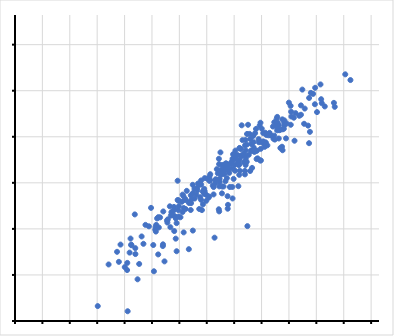
| Category | RTOC_mCherryhi...Normalized.means |
|---|---|
| 623.7666666667 | 49.133 |
| 876.1 | 132 |
| 325.2666666667 | 34.733 |
| 238.9 | 32.667 |
| 134.5 | 17.867 |
| 360.0666666667 | 60.833 |
| 285.5 | 57.6 |
| 694.4 | 115.5 |
| 88.9 | 14.033 |
| 983.6333333333 | 159.933 |
| 6814.9333333333 | 844.1 |
| 92.6333333333 | 22.267 |
| 13055.3333333333 | 2520.9 |
| 867.4666666667 | 171.267 |
| 4717.8 | 908.8 |
| 3036.4666666667 | 1241.567 |
| 989.1333333333 | 392.233 |
| 1431.8 | 69.533 |
| 701.2666666667 | 108.333 |
| 69.2 | 5.367 |
| 224.8333333333 | 59.933 |
| 175.7333333333 | 24.067 |
| 453.1 | 112.767 |
| 1344.4 | 366.3 |
| 169.1666666667 | 40.2 |
| 1138.7666666667 | 231.467 |
| 752.1666666667 | 186.467 |
| 68.2333333333 | 18.533 |
| 12783.0666666667 | 2840.733 |
| 132.3 | 39.367 |
| 6010.6666666667 | 1513.467 |
| 6649.3666666667 | 1432.867 |
| 1806.6666666667 | 523.3 |
| 10141.6 | 2551.367 |
| 1534.5333333333 | 365.5 |
| 1979.4666666667 | 501.133 |
| 251.2333333333 | 92.833 |
| 423.4666666667 | 116.5 |
| 3803.1333333333 | 975.533 |
| 83.9 | 35.867 |
| 1612.4 | 401.267 |
| 1855.0 | 535.167 |
| 918.3 | 225.767 |
| 9401.9333333333 | 2819.267 |
| 755.9666666667 | 229.433 |
| 3485.9666666667 | 682.867 |
| 481.1666666667 | 183.2 |
| 341.3666666667 | 112.967 |
| 3437.8666666667 | 758.733 |
| 19418.8666666667 | 5645.6 |
| 1792.5666666667 | 673.433 |
| 245.1666666667 | 272.667 |
| 149.8666666667 | 29.667 |
| 7899.7333333333 | 2725.633 |
| 1010.1666666667 | 288.167 |
| 485.5333333333 | 198.967 |
| 2769.6333333333 | 963.8 |
| 233.5 | 47.7 |
| 783.2333333333 | 229.333 |
| 344.2333333333 | 138.867 |
| 8334.3666666667 | 2151.8 |
| 708.8 | 262.867 |
| 1182.8666666667 | 368.3 |
| 709.5 | 288.767 |
| 3168.2 | 972.167 |
| 543.5666666667 | 169.633 |
| 1151.9666666667 | 436.533 |
| 2015.9333333333 | 502.3 |
| 608.7 | 180.533 |
| 2823.5666666667 | 1060.4 |
| 821.8 | 269.167 |
| 2864.8333333333 | 940.833 |
| 1164.6 | 325.433 |
| 1976.2 | 878.333 |
| 5325.6 | 1925.633 |
| 976.9 | 225.967 |
| 832.8333333333 | 461.067 |
| 2443.3 | 1070.233 |
| 285.5 | 120.067 |
| 103.1666666667 | 40.833 |
| 4275.5333333333 | 2596.133 |
| 168.5333333333 | 38.167 |
| 2009.6666666667 | 712.967 |
| 3213.4 | 1248.4 |
| 217.3 | 108.967 |
| 1455.3333333333 | 1468.867 |
| 29.1 | 3.4 |
| 1950.1333333333 | 1429.633 |
| 2373.5666666667 | 791.1 |
| 64.3333333333 | 20.267 |
| 1166.9666666667 | 445.333 |
| 4639.7666666667 | 1816.7 |
| 703.2666666667 | 229.9 |
| 1407.3333333333 | 481.167 |
| 1141.2 | 480.467 |
| 505.8 | 149.033 |
| 231.5333333333 | 92 |
| 536.7333333333 | 163.833 |
| 869.9333333333 | 117.433 |
| 3046.9 | 1862.4 |
| 2135.1333333333 | 891.467 |
| 68.5333333333 | 23 |
| 1047.8333333333 | 368.433 |
| 3602.4333333333 | 1303.7 |
| 641.6666666667 | 285.2 |
| 1311.6666666667 | 475.867 |
| 139.1333333333 | 62.5 |
| 4842.9666666667 | 2085.9 |
| 191.3666666667 | 85.3 |
| 3870.0666666667 | 1525.7 |
| 2510.4 | 1152.933 |
| 3298.7333333333 | 730.633 |
| 506.2 | 178.467 |
| 767.5333333333 | 363.033 |
| 3656.2666666667 | 1673.767 |
| 6105.9333333333 | 2392.967 |
| 249.0666666667 | 112.767 |
| 2561.2333333333 | 1079.933 |
| 233.9666666667 | 87.433 |
| 860.4 | 445.467 |
| 479.8333333333 | 213.333 |
| 847.0 | 377.633 |
| 3157.5 | 1453.433 |
| 277.8666666667 | 179.5 |
| 32.4666666667 | 6.267 |
| 2270.9 | 858.333 |
| 42.7333333333 | 21.933 |
| 392.8 | 179.333 |
| 118.5333333333 | 69.133 |
| 5552.2 | 1986.833 |
| 4289.9 | 1469.8 |
| 433.4 | 165.933 |
| 2557.8666666667 | 1072.233 |
| 635.9 | 253.033 |
| 3079.1666666667 | 1356.8 |
| 595.9333333333 | 235.8 |
| 2217.2 | 756.5 |
| 3634.5 | 1436.233 |
| 461.4 | 197.567 |
| 1176.2666666667 | 515.633 |
| 2273.2333333333 | 860.667 |
| 203.9666666667 | 67.3 |
| 209.0666666667 | 105.6 |
| 5554.7 | 2633.3 |
| 140.1333333333 | 67.5 |
| 263.2333333333 | 90.8 |
| 883.6666666667 | 398.2 |
| 353.4666666667 | 157.6 |
| 238.7333333333 | 76.067 |
| 1221.7666666667 | 582.967 |
| 1375.5 | 535.133 |
| 1129.8 | 459.067 |
| 152.2333333333 | 66.767 |
| 1481.6 | 593.667 |
| 330.0666666667 | 145.133 |
| 223.3333333333 | 124.067 |
| 660.6666666667 | 386.167 |
| 443.1333333333 | 153.333 |
| 403.7666666667 | 203.9 |
| 249.4 | 150.933 |
| 808.2 | 399.467 |
| 983.6333333333 | 529.367 |
| 400.6333333333 | 218.067 |
| 1823.2 | 673.5 |
| 1175.7 | 722.633 |
| 465.2666666667 | 133.967 |
| 75.7 | 39.867 |
| 1676.9 | 742.733 |
| 360.7 | 187.833 |
| 1369.8 | 680.367 |
| 1110.9333333333 | 592 |
| 639.9333333333 | 277.767 |
| 895.3666666667 | 389.133 |
| 550.5 | 270.6 |
| 141.2 | 59.067 |
| 1344.9666666667 | 330.267 |
| 3002.5 | 1426.4 |
| 6826.5333333333 | 3293.933 |
| 72.7333333333 | 31.333 |
| 864.1333333333 | 447.733 |
| 1310.5666666667 | 619.767 |
| 851.4 | 295.067 |
| 1705.9333333333 | 648.967 |
| 297.5666666667 | 157.2 |
| 1556.6333333333 | 669.933 |
| 299.5666666667 | 116.467 |
| 1215.8 | 708.267 |
| 84.2 | 30 |
| 2255.7666666667 | 1155.233 |
| 3298.9333333333 | 1267.267 |
| 375.4333333333 | 213.067 |
| 187.1 | 82.533 |
| 2138.1333333333 | 1142.567 |
| 3495.9 | 1282.3 |
| 1596.0666666667 | 670.367 |
| 3468.7 | 1729.667 |
| 793.7 | 333.6 |
| 189.1 | 77.433 |
| 472.5333333333 | 194.8 |
| 723.9333333333 | 639.733 |
| 609.6666666667 | 225.4 |
| 423.7666666667 | 242.533 |
| 7133.2333333333 | 3837.733 |
| 142.4666666667 | 72.2 |
| 377.2 | 159.567 |
| 4328.6333333333 | 2174.167 |
| 2314.9333333333 | 1079.867 |
| 973.0333333333 | 491.833 |
| 1041.7666666667 | 439.467 |
| 1331.3 | 585.8 |
| 52.9 | 32.1 |
| 559.6666666667 | 331.667 |
| 1044.1666666667 | 535.667 |
| 786.1666666667 | 361.1 |
| 254.0 | 149.133 |
| 1914.2666666667 | 868.8 |
| 359.4 | 241.133 |
| 904.8333333333 | 345.267 |
| 1055.1 | 521.967 |
| 1239.9 | 1445.7 |
| 6967.8 | 1187.167 |
| 1671.5666666667 | 872 |
| 7551.1333333333 | 3723.633 |
| 1073.3333333333 | 584.767 |
| 3004.0 | 1766.067 |
| 157.1333333333 | 90.467 |
| 342.1666666667 | 175.9 |
| 3082.4666666667 | 1566.333 |
| 4356.2333333333 | 1883.067 |
| 17030.0 | 6706.967 |
| 252.1666666667 | 126.433 |
| 746.6666666667 | 350.633 |
| 7949.4333333333 | 4472.433 |
| 941.4666666667 | 444.933 |
| 75.8666666667 | 39.133 |
| 1780.5 | 1294.767 |
| 558.0333333333 | 278.5 |
| 1993.9 | 1562 |
| 677.4666666667 | 340.467 |
| 272.0 | 144.7 |
| 206.5 | 95.567 |
| 9257.3333333333 | 3171.8 |
| 1227.8 | 571 |
| 170.4333333333 | 108.133 |
| 1418.6 | 1113.867 |
| 1082.1333333333 | 580.133 |
| 245.1666666667 | 152.6 |
| 942.2 | 462.633 |
| 754.3333333333 | 437.267 |
| 699.4 | 449.5 |
| 1741.0333333333 | 1142.5 |
| 326.5333333333 | 139.733 |
| 996.4 | 604.667 |
| 1580.2333333333 | 824.267 |
| 411.1 | 250.867 |
| 1360.0333333333 | 928.867 |
| 848.7666666667 | 419.633 |
| 736.0333333333 | 326.533 |
| 1369.5666666667 | 437.467 |
| 145.7666666667 | 87.733 |
| 1899.2 | 953.5 |
| 57.7666666667 | 39.9 |
| 55.4 | 23.733 |
| 3633.7 | 1555.967 |
| 2733.5 | 1393.1 |
| 225.1666666667 | 114.933 |
| 525.4333333333 | 287.333 |
| 486.4333333333 | 295.1 |
| 98.5666666667 | 50.967 |
| 9100.5333333333 | 4948.8 |
| 277.8333333333 | 106.333 |
| 224.2 | 94.733 |
| 108.5666666667 | 72.2 |
| 74.4333333333 | 47.833 |
| 1534.1333333333 | 957.733 |
| 82.8666666667 | 98.933 |
| 308.6333333333 | 201.1 |
| 820.2333333333 | 408.9 |
| 1057.0666666667 | 674.933 |
| 2141.9666666667 | 841.1 |
| 283.5666666667 | 171.8 |
| 4090.6333333333 | 2861.667 |
| 201.1666666667 | 126.3 |
| 549.0333333333 | 310.1 |
| 150.1666666667 | 91.033 |
| 734.8666666667 | 380.167 |
| 443.6333333333 | 274.7 |
| 1654.2 | 1047.767 |
| 695.8666666667 | 527.633 |
| 1346.8333333333 | 788.167 |
| 125.0 | 120.467 |
| 1174.1 | 730.7 |
| 5749.0666666667 | 4236.733 |
| 1512.1666666667 | 1116.167 |
| 2059.5 | 1305.333 |
| 1411.8666666667 | 808.233 |
| 1265.8333333333 | 925.667 |
| 295.8333333333 | 152.767 |
| 805.7666666667 | 445.6 |
| 2826.2333333333 | 1586.5 |
| 444.8 | 242.667 |